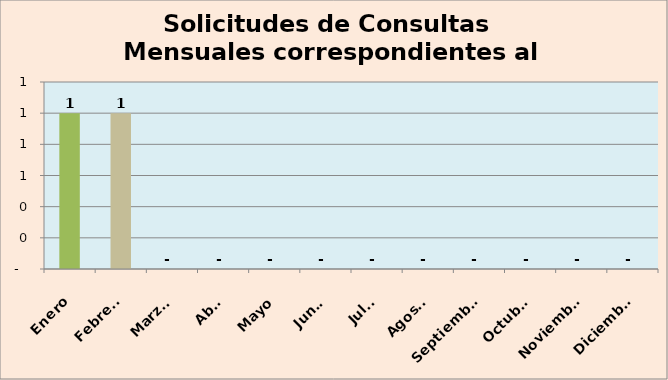
| Category | Evaluaciones  |
|---|---|
| Enero | 1 |
| Febrero | 1 |
| Marzo  | 0 |
| Abril | 0 |
| Mayo | 0 |
| Junio | 0 |
| Julio | 0 |
| Agosto | 0 |
| Septiembre | 0 |
| Octubre | 0 |
| Noviembre | 0 |
| Diciembre | 0 |